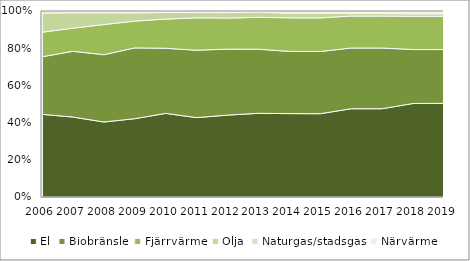
| Category | El | Biobränsle | Fjärrvärme | Olja | Naturgas/stadsgas | Närvärme |
|---|---|---|---|---|---|---|
| 2006 | 0.447 | 0.311 | 0.133 | 0.103 | 0.009 | 0.003 |
| 2007 | 0.43 | 0.354 | 0.124 | 0.083 | 0.006 | 0.003 |
| 2008 | 0.403 | 0.362 | 0.162 | 0.063 | 0.006 | 0.003 |
| 2009 | 0.421 | 0.381 | 0.144 | 0.044 | 0.006 | 0.004 |
| 2010 | 0.45 | 0.35 | 0.157 | 0.036 | 0.006 | 0.002 |
| 2011 | 0.427 | 0.362 | 0.174 | 0.028 | 0.004 | 0.005 |
| 2012 | 0.44 | 0.355 | 0.167 | 0.029 | 0.005 | 0.004 |
| 2013 | 0.45 | 0.345 | 0.172 | 0.028 | 0.003 | 0.003 |
| 2014 | 0.448 | 0.335 | 0.18 | 0.024 | 0.008 | 0.005 |
| 2015 | 0.448 | 0.335 | 0.181 | 0.024 | 0.008 | 0.005 |
| 2016 | 0.475 | 0.326 | 0.172 | 0.013 | 0.008 | 0.006 |
| 2017 | 0.475 | 0.326 | 0.172 | 0.013 | 0.008 | 0.006 |
| 2018 | 0.503 | 0.29 | 0.179 | 0.013 | 0.009 | 0.007 |
| 2019 | 0.503 | 0.289 | 0.179 | 0.013 | 0.009 | 0.007 |